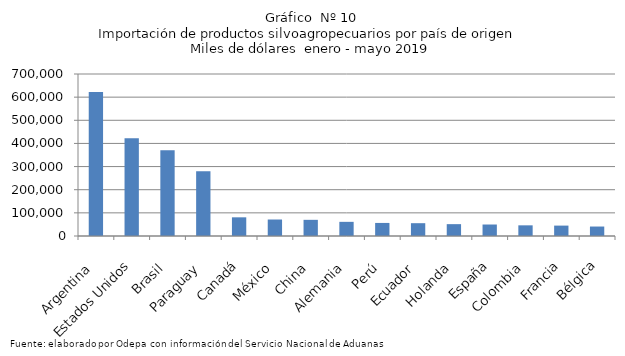
| Category | Series 0 |
|---|---|
| Argentina | 622064.17 |
| Estados Unidos | 422071.739 |
| Brasil | 370559.493 |
| Paraguay | 279710.274 |
| Canadá | 80706.354 |
| México | 71240.974 |
| China | 69859.679 |
| Alemania | 61168.045 |
| Perú | 56439.84 |
| Ecuador | 55359.212 |
| Holanda | 51210.197 |
| España | 49633.516 |
| Colombia | 46087.042 |
| Francia | 44934.866 |
| Bélgica | 40891.463 |